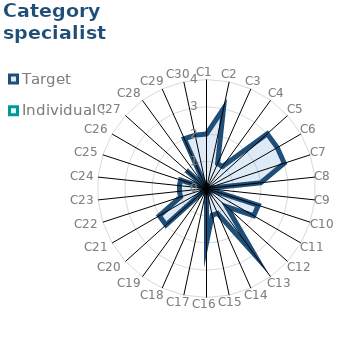
| Category | Target | Individual 5 |
|---|---|---|
| C1 | 2 | 0 |
| C2 | 3 | 0 |
| C3 | 1 | 0 |
| C4 | 1 | 0 |
| C5 | 3 | 0 |
| C6 | 3 | 0 |
| C7 | 3 | 0 |
| C8 | 2 | 0 |
| C9 | 0 | 0 |
| C10 | 2 | 0 |
| C11 | 2 | 0 |
| C12 | 1 | 0 |
| C13 | 3 | 0 |
| C14 | 1 | 0 |
| C15 | 1 | 0 |
| C16 | 2 | 0 |
| C17 | 0 | 0 |
| C18 | 0 | 0 |
| C19 | 0 | 0 |
| C20 | 2 | 0 |
| C21 | 2 | 0 |
| C22 | 1 | 0 |
| C23 | 1 | 0 |
| C24 | 1 | 0 |
| C25 | 1 | 0 |
| C26 | 0 | 0 |
| C27 | 1 | 0 |
| C28 | 0 | 0 |
| C29 | 2 | 0 |
| C30 | 2 | 0 |